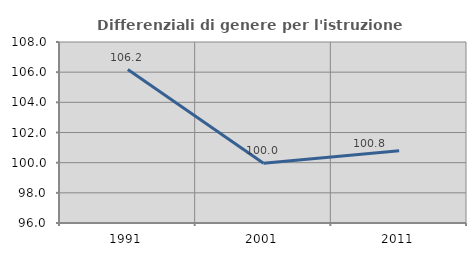
| Category | Differenziali di genere per l'istruzione superiore |
|---|---|
| 1991.0 | 106.171 |
| 2001.0 | 99.955 |
| 2011.0 | 100.796 |